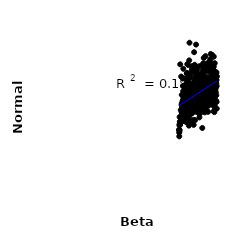
| Category | Series 0 |
|---|---|
| 36.87177216005822 | 774.494 |
| 36.67191003613363 | 627.892 |
| 40.42040320326657 | 749.544 |
| 40.04379194163052 | 779.877 |
| 40.82334418344468 | 832.307 |
| 36.13214100607175 | 646.233 |
| 38.83391503651969 | 577.009 |
| 43.79376058488306 | 740.854 |
| 37.76381929759466 | 639.082 |
| 41.60104819145439 | 674.128 |
| 40.51737628001285 | 740.859 |
| 42.995591476578014 | 726.689 |
| 42.74004964921001 | 778.202 |
| 40.05077609693 | 654.74 |
| 39.669132210913375 | 609.296 |
| 39.822856459848786 | 718.578 |
| 41.82769226738635 | 648.875 |
| 42.271210473916504 | 707.442 |
| 40.26916152866131 | 788.634 |
| 41.80156071782762 | 744.595 |
| 40.44357151263231 | 674.608 |
| 40.6531303391531 | 734.386 |
| 43.14055599896996 | 631.546 |
| 35.88737491483634 | 643.633 |
| 38.319838453313274 | 857.381 |
| 43.426457342484824 | 727.508 |
| 41.68050936085601 | 704.56 |
| 36.54840314828016 | 628.615 |
| 36.19904748256604 | 657.765 |
| 40.61389016487844 | 697.331 |
| 39.506154461127394 | 663.845 |
| 39.26028712870591 | 753.634 |
| 41.78294276659636 | 579.779 |
| 37.490566735940305 | 891.676 |
| 39.60077263993564 | 614.426 |
| 36.34690202205937 | 541.601 |
| 39.999876569287245 | 856.465 |
| 35.87876497779151 | 552.156 |
| 41.04498831203703 | 654.455 |
| 37.15739415576618 | 687.217 |
| 37.55942399474461 | 999.563 |
| 41.247119952096746 | 573.206 |
| 40.56850159587319 | 718.231 |
| 38.108226112940116 | 692.555 |
| 41.596209743952194 | 665.877 |
| 42.10728003256695 | 613.667 |
| 37.280362564439926 | 862.778 |
| 37.74817084369337 | 738.433 |
| 43.42696737114637 | 750.719 |
| 37.300453870197934 | 551.413 |
| 39.40318553356439 | 834.441 |
| 43.1144222897061 | 663.537 |
| 37.95953104454556 | 749.045 |
| 43.667267175808995 | 733.985 |
| 42.14087442347471 | 676.805 |
| 42.75859694584614 | 734.247 |
| 41.95953409607046 | 825.522 |
| 42.6014551861861 | 683.137 |
| 36.99080829140392 | 814.492 |
| 42.202547743909754 | 729.429 |
| 37.710430775132046 | 669.674 |
| 39.31324717690916 | 735.844 |
| 43.56589018369017 | 667.926 |
| 35.16095172142658 | 499.237 |
| 36.57085032023322 | 665.543 |
| 38.55994494562483 | 830.56 |
| 43.32015378324909 | 812.123 |
| 38.53733009001208 | 691.127 |
| 37.052236778944945 | 709.698 |
| 36.39387617249576 | 612.051 |
| 41.22097835813886 | 741.121 |
| 37.913545587363124 | 562.684 |
| 38.14359153643649 | 714.434 |
| 35.09535930642868 | 466.673 |
| 39.45917708434072 | 700.037 |
| 36.89626942842697 | 669.985 |
| 38.99159239985502 | 631.91 |
| 44.00917843850428 | 643.774 |
| 42.75712783719256 | 633.641 |
| 41.776698267881095 | 644.787 |
| 40.278032657066724 | 654.773 |
| 43.33844495393252 | 832.536 |
| 43.26225450080219 | 700.417 |
| 41.13866495908827 | 667.228 |
| 42.073197031833814 | 849.463 |
| 37.479418587103844 | 657.965 |
| 40.0186508965625 | 747.171 |
| 42.97365469680303 | 619.642 |
| 39.18675121893716 | 677.282 |
| 42.65497777222715 | 818.721 |
| 38.11569465566261 | 711.397 |
| 43.19045757439028 | 740.291 |
| 43.03208642284304 | 653.709 |
| 37.5920253075302 | 754.305 |
| 43.81646204226602 | 729.745 |
| 43.844672420835096 | 757.984 |
| 36.02976840929376 | 703.245 |
| 43.19517589826825 | 658.937 |
| 41.218975737655015 | 649.112 |
| 39.0780284330339 | 644.377 |
| 38.84453139206573 | 669.954 |
| 40.419161941990765 | 749.416 |
| 35.08212151567414 | 448.77 |
| 40.91775960760754 | 755.817 |
| 42.46565889755924 | 781.876 |
| 39.36522776082027 | 772.189 |
| 38.313231967729614 | 817.153 |
| 39.57397125736814 | 653.509 |
| 40.57602381305 | 691.69 |
| 37.411325452849475 | 491.987 |
| 43.251257878885525 | 800.377 |
| 39.150009331137824 | 636.303 |
| 37.67073141008073 | 689.779 |
| 41.135216967790896 | 855.255 |
| 42.860999513737184 | 791.736 |
| 39.3021074833446 | 819.547 |
| 36.641294956603126 | 584.841 |
| 41.927565939358395 | 686.007 |
| 38.29721816445969 | 655.153 |
| 40.457310551694974 | 673.947 |
| 36.31854924533587 | 737.296 |
| 36.39659636406131 | 550.042 |
| 43.817167858534035 | 734.275 |
| 37.204366766560995 | 556.562 |
| 38.98166230644834 | 789.173 |
| 38.20496158981922 | 675.672 |
| 40.02705950851143 | 762.114 |
| 36.06801528572434 | 839.773 |
| 38.895070187078886 | 525.405 |
| 37.10844033640477 | 612.782 |
| 40.64416438741477 | 477.639 |
| 42.581726898422524 | 711.702 |
| 39.62851662206896 | 667.912 |
| 36.46202968676486 | 637.304 |
| 41.68006192864348 | 583.617 |
| 39.019464001738314 | 607.273 |
| 41.61923529505606 | 691.306 |
| 39.0592203094087 | 751.661 |
| 42.0555500734228 | 747.216 |
| 41.42533709099894 | 696.586 |
| 44.03515423540283 | 677.868 |
| 42.32038491615377 | 882.705 |
| 37.821546310046685 | 623.583 |
| 36.96831143060458 | 603.983 |
| 41.16500244202418 | 661.585 |
| 36.571576344117915 | 736.321 |
| 44.072459742214896 | 817.4 |
| 41.82946556596482 | 773.498 |
| 38.02737406712792 | 656.526 |
| 35.27944153186472 | 497.551 |
| 42.4559126067707 | 733.077 |
| 35.88522077540485 | 586.655 |
| 43.690279439624575 | 667.16 |
| 40.57012724078453 | 675.271 |
| 37.140270477975534 | 567.929 |
| 42.87656734644558 | 810.687 |
| 41.192230808892056 | 653.032 |
| 42.413403527628695 | 850.383 |
| 41.06679618200236 | 731.298 |
| 39.78269301391916 | 782.763 |
| 36.87354633088104 | 686.715 |
| 37.08550166271294 | 776.412 |
| 39.80084655338702 | 586.604 |
| 40.67761028258583 | 644.011 |
| 43.78390937809955 | 760.35 |
| 35.59112500529392 | 543.132 |
| 35.448026547858746 | 587.637 |
| 40.6590734317362 | 696.71 |
| 43.55840683325538 | 574.746 |
| 39.080120265115774 | 735.577 |
| 38.63773049003541 | 605.448 |
| 37.204056967545334 | 724.469 |
| 39.79976101635303 | 674.062 |
| 42.42246417862107 | 636.12 |
| 37.09993467435219 | 570.348 |
| 41.29071227119021 | 725.945 |
| 37.06327357872107 | 802.673 |
| 37.40783184654916 | 721.067 |
| 41.6375950221393 | 790.513 |
| 40.511634709220345 | 672.364 |
| 35.12808856606085 | 457.082 |
| 38.678926257598505 | 941.723 |
| 38.55229866563599 | 527.344 |
| 43.23992374570816 | 864.962 |
| 40.95709441735489 | 662.084 |
| 42.742162052577065 | 746.066 |
| 38.42197573560272 | 721.818 |
| 36.88788181026909 | 752.023 |
| 43.984334023999594 | 783.203 |
| 39.89892353472588 | 681.542 |
| 38.8045911930712 | 665.741 |
| 36.13590622256845 | 571.975 |
| 40.037000684677764 | 696.818 |
| 39.130194859035704 | 662.382 |
| 43.23600616558382 | 720.726 |
| 37.43462721315776 | 537.299 |
| 36.69579774340355 | 589.042 |
| 36.070476124517484 | 567.602 |
| 41.04952848917473 | 675.074 |
| 40.74109211454985 | 862.497 |
| 37.69909489967793 | 571.774 |
| 37.347197736203555 | 587.584 |
| 40.82872110316906 | 817.516 |
| 41.57559696858168 | 760.985 |
| 41.45300668785106 | 702.401 |
| 38.25141002110805 | 648.697 |
| 35.31289571336991 | 867.416 |
| 36.239182082545604 | 570.827 |
| 42.548776932272695 | 897.256 |
| 36.470616850002116 | 584.898 |
| 42.54085791848185 | 634.957 |
| 36.58595311559333 | 565.057 |
| 42.283317584663166 | 837.575 |
| 42.75140615676324 | 765.606 |
| 40.44961368717038 | 742.831 |
| 40.04842561304866 | 721.386 |
| 36.59353185524217 | 780.012 |
| 36.12678579135145 | 734.544 |
| 40.43615585912401 | 648.618 |
| 42.76323661456345 | 735.517 |
| 37.175746731402036 | 539.553 |
| 41.26920622376262 | 845.991 |
| 39.20103711948834 | 652.393 |
| 35.94071873722987 | 780.476 |
| 35.147628187692014 | 493.667 |
| 40.85879704775736 | 872.79 |
| 38.59030312240669 | 692 |
| 35.08692308550102 | 467.844 |
| 35.21540040789022 | 516.821 |
| 42.54325183505119 | 675.409 |
| 40.110540881155096 | 631.024 |
| 41.080774915756365 | 593.53 |
| 35.929075849999556 | 678.663 |
| 39.07116715885918 | 748.485 |
| 36.003674450801576 | 574.97 |
| 41.62200035245098 | 860.765 |
| 40.338509751582706 | 603.823 |
| 43.36411120989891 | 740.843 |
| 42.183799669093005 | 751.364 |
| 40.926496528124176 | 727.513 |
| 41.83505551440896 | 747.278 |
| 40.74100763600318 | 755.013 |
| 42.41425386379329 | 845.44 |
| 36.329910530176015 | 652.225 |
| 37.406649334194235 | 632.931 |
| 38.73871332227962 | 736.594 |
| 41.9183410089006 | 773.116 |
| 36.066988507537665 | 556.603 |
| 39.01103632383603 | 760.28 |
| 40.196018479292746 | 661.502 |
| 41.38212724815927 | 767.455 |
| 36.09911866293456 | 549.651 |
| 39.14480112422507 | 988.175 |
| 40.72293967125695 | 615.738 |
| 38.9535803495826 | 613.869 |
| 37.90598867369467 | 517.534 |
| 42.68823781967332 | 930.803 |
| 39.95196494601761 | 542.414 |
| 43.55941791354261 | 716.353 |
| 42.29527195444553 | 700.357 |
| 41.10356944020314 | 631.881 |
| 40.81033539362062 | 768.099 |
| 43.05396392618225 | 924.513 |
| 41.01525442669287 | 778.839 |
| 40.65693561213226 | 714.059 |
| 37.118353121745415 | 722.913 |
| 40.33281354839995 | 797.989 |
| 36.78466951697607 | 708.578 |
| 43.83566374576098 | 713.062 |
| 39.27299779291126 | 812.34 |
| 43.926696611340866 | 695.603 |
| 37.02508246710013 | 868.714 |
| 43.19269584436784 | 913.936 |
| 35.70342550342165 | 629.062 |
| 43.18705789087856 | 838.375 |
| 37.703460074204486 | 664.585 |
| 38.767659867736796 | 772.339 |
| 40.0433062245496 | 800.776 |
| 36.52313283345179 | 575.545 |
| 36.79564115079951 | 606.787 |
| 39.361998016991166 | 691.156 |
| 42.57605011621225 | 666.959 |
| 39.052017913547814 | 679.121 |
| 43.14267006863765 | 730.606 |
| 40.72191206463334 | 805.703 |
| 36.14276682251381 | 602.156 |
| 41.60226606809434 | 689.497 |
| 41.62711686736593 | 850.166 |
| 37.73638766490008 | 788.646 |
| 44.02836314675959 | 749.837 |
| 39.25363871715713 | 618.559 |
| 42.13490171266312 | 729.533 |
| 41.93977492396413 | 750.031 |
| 37.92536262973644 | 677.174 |
| 40.49384749826507 | 598.592 |
| 41.19155228288993 | 732.555 |
| 39.821387622148656 | 641.086 |
| 42.27917108035899 | 661.474 |
| 41.64870916081162 | 871.347 |
| 37.01178783435428 | 654.519 |
| 42.81202985842014 | 839.613 |
| 40.81615208554285 | 803.46 |
| 40.633247191650796 | 728.291 |
| 41.26580472100469 | 618.157 |
| 38.630315320897935 | 591.699 |
| 36.33952141375972 | 595.946 |
| 38.058188457982304 | 697.039 |
| 39.71670540059132 | 625.777 |
| 39.7579542906601 | 669.551 |
| 43.76756768239701 | 594.039 |
| 36.250987850837916 | 640.585 |
| 40.5561864155624 | 648.5 |
| 41.21046281917751 | 851.169 |
| 39.738450830490805 | 710.1 |
| 42.102191425480896 | 728.089 |
| 42.73117313053593 | 743.419 |
| 39.23055648097044 | 742.616 |
| 35.97221504541754 | 551.183 |
| 43.77227112650759 | 725.84 |
| 41.728674230646384 | 612.441 |
| 39.624196305675724 | 704.463 |
| 36.198352357176944 | 662.149 |
| 39.38612360832002 | 583.002 |
| 41.32928738039415 | 661.183 |
| 39.0840016509246 | 722.885 |
| 37.288186049211276 | 664.516 |
| 35.864071458409995 | 587.468 |
| 36.60533336079528 | 550.668 |
| 40.239071698857416 | 665.184 |
| 41.740942511891575 | 732.93 |
| 41.41499218536148 | 917.451 |
| 43.38905102779565 | 579.844 |
| 43.83512097721869 | 750.519 |
| 40.894063848175435 | 673.134 |
| 35.17359197003894 | 544.928 |
| 43.76056208272725 | 683.617 |
| 35.5687211074821 | 533.754 |
| 39.76702771335186 | 665.896 |
| 43.977506291162825 | 783.719 |
| 35.980738513005264 | 594.925 |
| 35.637330363451184 | 619.169 |
| 38.49208168698644 | 719.866 |
| 39.16953706074967 | 631.341 |
| 37.84518323769039 | 613.549 |
| 43.107951822667516 | 775.591 |
| 38.216231314112264 | 569.899 |
| 38.72293624095538 | 677.051 |
| 36.79738580933545 | 558.564 |
| 40.03195068914717 | 563.24 |
| 42.8036970618972 | 707.722 |
| 42.20212431862208 | 665.396 |
| 38.13618317946285 | 692.565 |
| 44.092018611510014 | 771.771 |
| 37.65641180918334 | 623.327 |
| 42.690302848901645 | 663.21 |
| 41.422941362147434 | 632.449 |
| 40.49956429712762 | 591.912 |
| 39.677634857855104 | 649.038 |
| 36.04483269362508 | 732.309 |
| 40.95065115652235 | 708.554 |
| 43.6330973586586 | 772.433 |
| 40.87306705485426 | 776.419 |
| 36.14390160904872 | 520.594 |
| 43.64735272535519 | 610.292 |
| 38.81838408158076 | 643.75 |
| 37.59891420157155 | 602.192 |
| 35.664747125221886 | 573.751 |
| 36.11692113441588 | 660.94 |
| 43.250958678726896 | 705.351 |
| 41.83171487314172 | 651.338 |
| 43.051469089152334 | 818.416 |
| 40.99554646092917 | 906.047 |
| 42.05073053194674 | 576.719 |
| 38.423497010988726 | 655.163 |
| 41.26438728021404 | 714.266 |
| 39.846609448644024 | 746.308 |
| 38.159129516612325 | 727.886 |
| 40.4518168789657 | 702.676 |
| 36.66064359235982 | 615.983 |
| 35.6954152777864 | 680.2 |
| 42.19908274708547 | 839.719 |
| 41.00134993838021 | 773.679 |
| 38.44667312912146 | 718.041 |
| 35.78415157829041 | 562.331 |
| 44.18452228686668 | 794.064 |
| 43.61880041882215 | 806.154 |
| 43.48856911196925 | 720.993 |
| 43.03242632934395 | 830.224 |
| 38.16288476817593 | 842.209 |
| 43.12902875838023 | 844.773 |
| 42.68613171124222 | 690.453 |
| 41.078327249111176 | 781.618 |
| 42.79183757627929 | 740.002 |
| 41.18969564988276 | 823.323 |
| 38.74732130619232 | 646.768 |
| 38.4689943544213 | 653.817 |
| 40.150271056345225 | 717.624 |
| 39.27152261252195 | 635.865 |
| 36.898112727623555 | 811.713 |
| 41.12715757151015 | 596.286 |
| 39.462360394774656 | 747.702 |
| 39.847154388451195 | 768.339 |
| 41.82922683569412 | 640.838 |
| 42.15508841725814 | 705.535 |
| 39.783959061250776 | 709.829 |
| 41.688927187571686 | 723.819 |
| 38.5741458428705 | 496.585 |
| 40.56061261790433 | 682.084 |
| 42.27376823597967 | 678.617 |
| 35.54379438561534 | 792.385 |
| 38.54854724885215 | 748.339 |
| 38.83002126769375 | 619.136 |
| 35.8354971819868 | 547.179 |
| 39.926987300920906 | 748.99 |
| 43.11839603932249 | 692.09 |
| 44.113097225777466 | 637 |
| 38.84800190957275 | 687.709 |
| 43.9066360393407 | 724.995 |
| 41.43150128945457 | 731.806 |
| 39.259258118059584 | 851.081 |
| 39.06453590607199 | 675.662 |
| 37.09018860550945 | 650.772 |
| 37.136191614855704 | 713.472 |
| 40.40319297556353 | 663.265 |
| 38.23507930703406 | 815.863 |
| 35.120873683157015 | 465.59 |
| 42.301503275154516 | 751.727 |
| 35.8715478358249 | 552.696 |
| 41.004373189508684 | 847.965 |
| 36.97232795438277 | 596.975 |
| 38.81443945243561 | 864.616 |
| 37.3060822666138 | 589.289 |
| 39.72933760827928 | 569.434 |
| 38.54212947933293 | 698.469 |
| 42.19088930857223 | 662.487 |
| 40.15724449312069 | 711.213 |
| 36.748623064613106 | 513.431 |
| 42.95470800298879 | 679.798 |
| 36.46579291286205 | 625.459 |
| 44.14299480146912 | 596.245 |
| 38.09996099959511 | 828.762 |
| 35.77025042817914 | 566.411 |
| 43.53542542606081 | 646.103 |
| 43.656497881868 | 627.256 |
| 36.681150631402836 | 595.264 |
| 40.02144451919596 | 579.893 |
| 44.13088342964679 | 734.505 |
| 36.078955345254506 | 559.954 |
| 42.028292455536466 | 635.887 |
| 40.099346871685285 | 676.062 |
| 39.49749357260508 | 655.631 |
| 38.13270390088277 | 723.488 |
| 35.746040004511336 | 600.447 |
| 35.749028409142404 | 590.96 |
| 42.473678253646966 | 791.168 |
| 37.17447432363145 | 661.677 |
| 42.38505710067285 | 663.165 |
| 39.92071125380386 | 746.317 |
| 39.356851578349456 | 646.839 |
| 40.6850010194429 | 632.759 |
| 43.42774103097521 | 914.545 |
| 42.800992819490446 | 772.681 |
| 42.93987643453862 | 691.481 |
| 39.359817999487326 | 727.042 |
| 38.7606140553969 | 676.181 |
| 42.58358216465723 | 878.477 |
| 43.95762298249247 | 818.919 |
| 39.45906175456296 | 702.795 |
| 43.2873471111144 | 727.18 |
| 39.214629469357824 | 684.813 |
| 39.323627746829615 | 680.591 |
| 39.304178820214474 | 637.253 |
| 41.3762817632511 | 847.726 |
| 43.425347217495755 | 854.633 |
| 36.67221579772398 | 641.726 |
| 40.15300485907399 | 807.459 |
| 41.40423064580042 | 601.382 |
| 43.42153140482976 | 763.098 |
| 38.38681496084884 | 610.153 |
| 37.32723694862114 | 757.067 |
| 36.981899596357 | 770.009 |
| 42.06840908649298 | 762.783 |
| 43.67789268429223 | 761.235 |
| 40.6701411992273 | 764.826 |
| 43.83546043219931 | 757.994 |
| 42.22317153938879 | 622.526 |
| 43.17884551505631 | 735.871 |
| 42.75573705971715 | 765.859 |
| 40.47488256981396 | 624.595 |
| 35.09189451555318 | 426.489 |
| 36.75065726413035 | 557.275 |
| 38.98085996769293 | 598.463 |
| 41.89580993480348 | 779.385 |
| 40.31353015757276 | 722.392 |
| 36.463092412838506 | 537.163 |
| 35.31655172688356 | 510.374 |
| 39.42783057057325 | 662.621 |
| 36.01622933316437 | 585.877 |
| 43.657394548883914 | 874.468 |
| 40.9686964482763 | 672.879 |